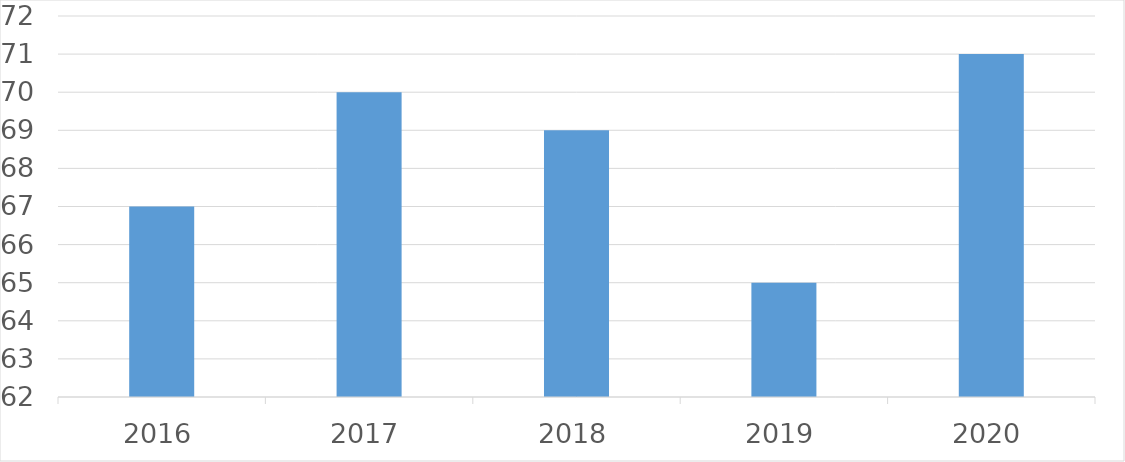
| Category | Series 0 |
|---|---|
| 2016 | 67 |
| 2017 | 70 |
| 2018 | 69 |
| 2019 | 65 |
| 2020 | 71 |